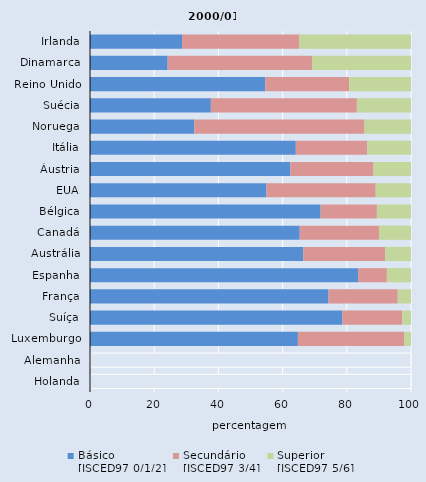
| Category | Básico
[ISCED97 0/1/2] | Secundário
[ISCED97 3/4] | Superior
[ISCED97 5/6] |
|---|---|---|---|
| Irlanda | 28.659 | 36.585 | 34.756 |
| Dinamarca | 24.194 | 44.96 | 30.847 |
| Reino Unido | 54.626 | 26.112 | 19.261 |
| Suécia | 37.644 | 45.497 | 16.859 |
| Noruega | 32.477 | 53.037 | 14.486 |
| Itália | 64.116 | 22.234 | 13.65 |
| Áustria | 62.428 | 25.888 | 11.684 |
| EUA | 54.962 | 34.043 | 10.995 |
| Bélgica | 71.832 | 17.539 | 10.629 |
| Canadá | 65.331 | 24.7 | 9.969 |
| Austrália | 66.415 | 25.551 | 8.035 |
| Espanha | 83.535 | 8.95 | 7.515 |
| França | 74.307 | 21.564 | 4.128 |
| Suíça | 78.608 | 18.674 | 2.718 |
| Luxemburgo | 64.767 | 33.151 | 2.082 |
| Alemanha | 0 | 100 | 0 |
| Holanda | 0 | 100 | 0 |